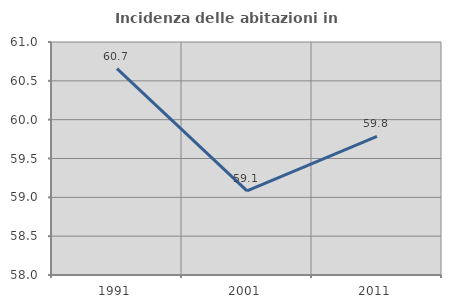
| Category | Incidenza delle abitazioni in proprietà  |
|---|---|
| 1991.0 | 60.658 |
| 2001.0 | 59.083 |
| 2011.0 | 59.786 |